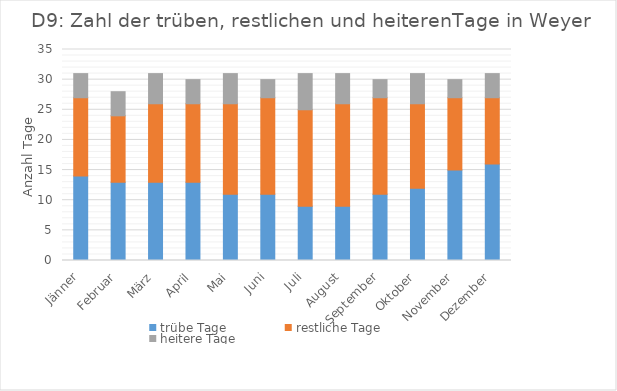
| Category | trübe Tage | restliche Tage | heitere Tage |
|---|---|---|---|
| Jänner | 14 | 13 | 4 |
| Februar | 13 | 11 | 4 |
| März | 13 | 13 | 5 |
| April | 13 | 13 | 4 |
| Mai | 11 | 15 | 5 |
| Juni | 11 | 16 | 3 |
| Juli | 9 | 16 | 6 |
| August | 9 | 17 | 5 |
| September | 11 | 16 | 3 |
| Oktober | 12 | 14 | 5 |
| November | 15 | 12 | 3 |
| Dezember | 16 | 11 | 4 |